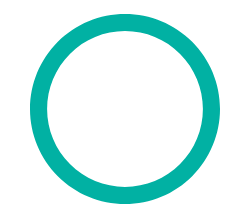
| Category | Series 0 |
|---|---|
| 0 | 1.008 |
| 1 | 0 |